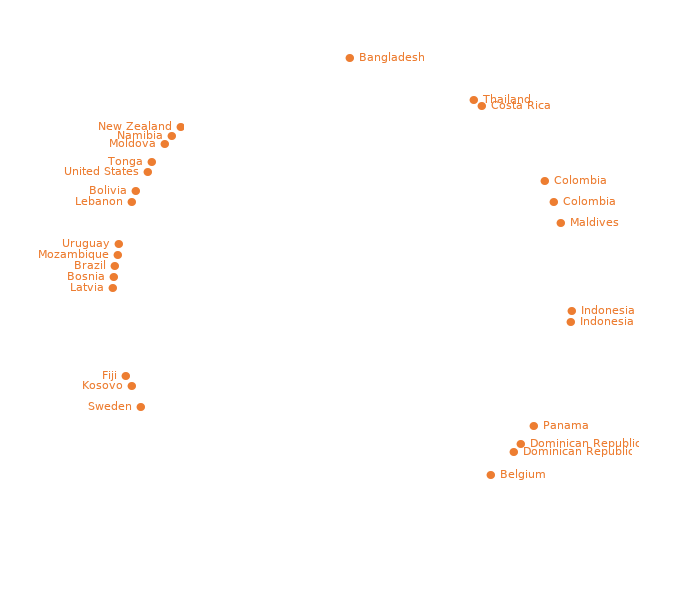
| Category | Dummy |
|---|---|
| ● Bangladesh | 1 |
|  | 1 |
|  | 1 |
|  | 1 |
|  | 1 |
|  | 1 |
|  | 1 |
|  | 1 |
|  | 1 |
|  | 1 |
|  | 1 |
|  | 1 |
| ● Thailand | 1 |
| ● Costa Rica | 1 |
|  | 1 |
|  | 1 |
|  | 1 |
|  | 1 |
|  | 1 |
|  | 1 |
|  | 1 |
|  | 1 |
| ● Colombia | 1 |
|  | 1 |
| ● Colombia | 1 |
|  | 1 |
| ● Maldives | 1 |
|  | 1 |
|  | 1 |
|  | 1 |
|  | 1 |
|  | 1 |
|  | 1 |
|  | 1 |
| ● Indonesia | 1 |
| ● Indonesia | 1 |
|  | 1 |
|  | 1 |
|  | 1 |
|  | 1 |
|  | 1 |
|  | 1 |
|  | 1 |
|  | 1 |
|  | 1 |
| ● Panama | 1 |
|  | 1 |
| ● Dominican Republic | 1 |
| ● Dominican Republic | 1 |
|  | 1 |
|  | 1 |
| ● Belgium | 1 |
|  | 1 |
|  | 1 |
|  | 1 |
|  | 1 |
|  | 1 |
|  | 1 |
|  | 1 |
|  | 1 |
|  | 1 |
|  | 1 |
|  | 1 |
|  | 1 |
|  | 1 |
|  | 1 |
|  | 1 |
|  | 1 |
|  | 1 |
|  | 1 |
|  | 1 |
|  | 1 |
|  | 1 |
|  | 1 |
|  | 1 |
|  | 1 |
|  | 1 |
|  | 1 |
|  | 1 |
|  | 1 |
|  | 1 |
|  | 1 |
|  | 1 |
|  | 1 |
|  | 1 |
|  | 1 |
|  | 1 |
|  | 1 |
| Sweden ● | 1 |
|  | 1 |
| Kosovo ● | 1 |
| Fiji ● | 1 |
|  | 1 |
|  | 1 |
|  | 1 |
|  | 1 |
|  | 1 |
|  | 1 |
|  | 1 |
| Latvia ● | 1 |
| Bosnia ● | 1 |
| Brazil ● | 1 |
| Mozambique ● | 1 |
| Uruguay ● | 1 |
|  | 1 |
|  | 1 |
|  | 1 |
| Lebanon ● | 1 |
| Bolivia ● | 1 |
|  | 1 |
| United States ● | 1 |
| Tonga ● | 1 |
|  | 1 |
| Moldova ● | 1 |
| Namibia ● | 1 |
| New Zealand ● | 1 |